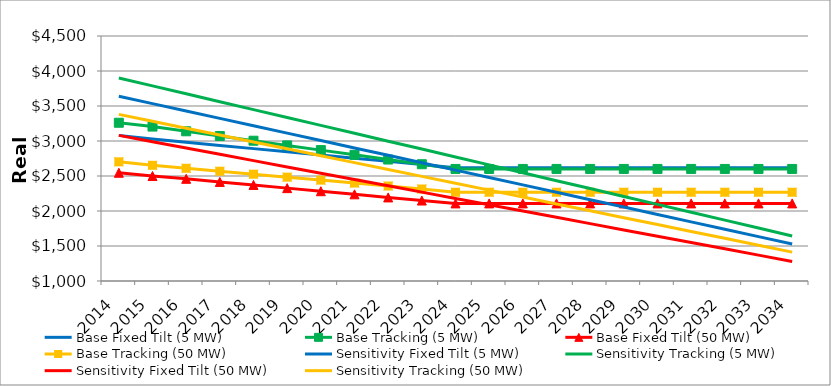
| Category | Base Fixed Tilt (5 MW)    | Base Tracking (5 MW)    | Base Fixed Tilt (50 MW)    | Base Tracking (50 MW)    | Sensitivity Fixed Tilt (5 MW)    | Sensitivity Tracking (5 MW)    | Sensitivity Fixed Tilt (50 MW)    | Sensitivity Tracking (50 MW)    |
|---|---|---|---|---|---|---|---|---|
| 2014.0 | 3080.387 | 3260.681 | 2546.092 | 2702.275 | 3640 | 3900 | 3080 | 3380 |
| 2015.0 | 3027.616 | 3205.871 | 2499.575 | 2652.905 | 3534.403 | 3787.172 | 2989.98 | 3281.635 |
| 2016.0 | 2982.088 | 3138.651 | 2459.703 | 2610.587 | 3428.807 | 3674.343 | 2899.959 | 3183.27 |
| 2017.0 | 2936.56 | 3071.431 | 2415.394 | 2568.27 | 3323.21 | 3561.515 | 2809.939 | 3084.906 |
| 2018.0 | 2891.032 | 3004.211 | 2372.166 | 2525.952 | 3217.614 | 3448.686 | 2719.919 | 2986.541 |
| 2019.0 | 2845.504 | 2936.991 | 2326.776 | 2483.635 | 3112.017 | 3335.858 | 2629.898 | 2888.176 |
| 2020.0 | 2799.976 | 2869.772 | 2282.466 | 2441.317 | 3006.421 | 3223.03 | 2539.878 | 2789.811 |
| 2021.0 | 2754.447 | 2802.552 | 2238.157 | 2399 | 2900.824 | 3110.201 | 2449.858 | 2691.447 |
| 2022.0 | 2708.919 | 2735.332 | 2193.848 | 2356.682 | 2795.227 | 2997.373 | 2359.837 | 2593.082 |
| 2023.0 | 2663.391 | 2668.112 | 2149.539 | 2314.365 | 2689.631 | 2884.544 | 2269.817 | 2494.717 |
| 2024.0 | 2618.898 | 2600.892 | 2108.472 | 2268.017 | 2584.034 | 2771.716 | 2179.797 | 2396.352 |
| 2025.0 | 2618.898 | 2600.892 | 2108.472 | 2268.017 | 2478.438 | 2658.887 | 2089.776 | 2297.988 |
| 2026.0 | 2618.898 | 2600.892 | 2108.472 | 2268.017 | 2372.841 | 2546.059 | 1999.756 | 2199.623 |
| 2027.0 | 2618.898 | 2600.892 | 2108.472 | 2268.017 | 2267.244 | 2433.231 | 1909.736 | 2101.258 |
| 2028.0 | 2618.898 | 2600.892 | 2108.472 | 2268.017 | 2161.648 | 2320.402 | 1819.715 | 2002.893 |
| 2029.0 | 2618.898 | 2600.892 | 2108.472 | 2268.017 | 2056.051 | 2207.574 | 1729.695 | 1904.529 |
| 2030.0 | 2618.898 | 2600.892 | 2108.472 | 2268.017 | 1950.455 | 2094.745 | 1639.675 | 1806.164 |
| 2031.0 | 2618.898 | 2600.892 | 2108.472 | 2268.017 | 1844.858 | 1981.917 | 1549.654 | 1707.799 |
| 2032.0 | 2618.898 | 2600.892 | 2108.472 | 2268.017 | 1739.262 | 1869.089 | 1459.634 | 1609.434 |
| 2033.0 | 2618.898 | 2600.892 | 2108.472 | 2268.017 | 1633.665 | 1756.26 | 1369.614 | 1511.07 |
| 2034.0 | 2618.898 | 2600.892 | 2108.472 | 2268.017 | 1528.068 | 1643.432 | 1279.593 | 1412.705 |